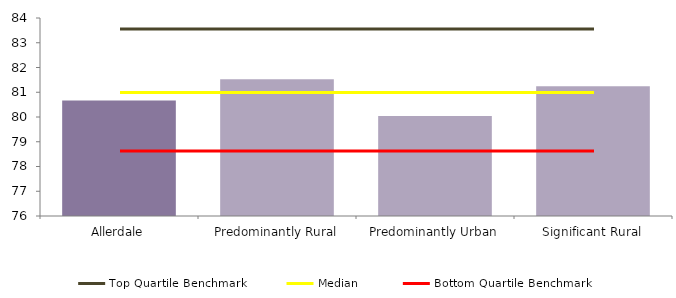
| Category | Series 0 |
|---|---|
| Allerdale | 80.665 |
| Predominantly Rural | 81.525 |
| Predominantly Urban | 80.041 |
| Significant Rural | 81.243 |